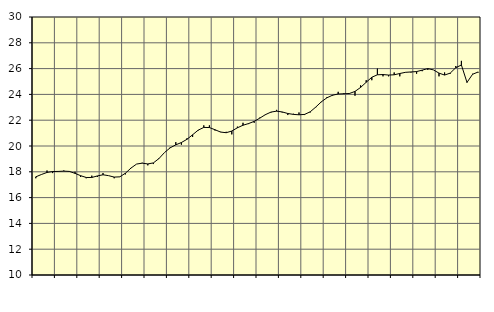
| Category | Piggar | Finansiell verksamhet, företagstjänster, SNI 64-82 |
|---|---|---|
| nan | 17.5 | 17.61 |
| 1.0 | 17.8 | 17.79 |
| 1.0 | 18.1 | 17.95 |
| 1.0 | 17.9 | 18.02 |
| nan | 18 | 18.03 |
| 2.0 | 18.1 | 18.05 |
| 2.0 | 18 | 18.03 |
| 2.0 | 18 | 17.88 |
| nan | 17.6 | 17.7 |
| 3.0 | 17.5 | 17.56 |
| 3.0 | 17.7 | 17.56 |
| 3.0 | 17.6 | 17.68 |
| nan | 17.9 | 17.77 |
| 4.0 | 17.7 | 17.7 |
| 4.0 | 17.5 | 17.59 |
| 4.0 | 17.6 | 17.61 |
| nan | 17.8 | 17.89 |
| 5.0 | 18.3 | 18.29 |
| 5.0 | 18.6 | 18.6 |
| 5.0 | 18.7 | 18.67 |
| nan | 18.5 | 18.61 |
| 6.0 | 18.6 | 18.69 |
| 6.0 | 19 | 19.03 |
| 6.0 | 19.5 | 19.5 |
| nan | 19.9 | 19.86 |
| 7.0 | 20.3 | 20.09 |
| 7.0 | 20.1 | 20.27 |
| 7.0 | 20.6 | 20.52 |
| nan | 20.7 | 20.87 |
| 8.0 | 21.2 | 21.23 |
| 8.0 | 21.6 | 21.44 |
| 8.0 | 21.6 | 21.43 |
| nan | 21.2 | 21.26 |
| 9.0 | 21.1 | 21.08 |
| 9.0 | 21.1 | 21.03 |
| 9.0 | 20.9 | 21.16 |
| nan | 21.5 | 21.41 |
| 10.0 | 21.8 | 21.61 |
| 10.0 | 21.7 | 21.74 |
| 10.0 | 21.8 | 21.91 |
| nan | 22.2 | 22.16 |
| 11.0 | 22.4 | 22.43 |
| 11.0 | 22.6 | 22.63 |
| 11.0 | 22.8 | 22.7 |
| nan | 22.6 | 22.64 |
| 12.0 | 22.4 | 22.52 |
| 12.0 | 22.5 | 22.45 |
| 12.0 | 22.6 | 22.42 |
| nan | 22.4 | 22.45 |
| 13.0 | 22.6 | 22.65 |
| 13.0 | 23 | 23.02 |
| 13.0 | 23.4 | 23.43 |
| nan | 23.8 | 23.74 |
| 14.0 | 23.9 | 23.94 |
| 14.0 | 24.2 | 24.03 |
| 14.0 | 24.1 | 24.05 |
| nan | 24.1 | 24.07 |
| 15.0 | 23.9 | 24.23 |
| 15.0 | 24.7 | 24.54 |
| 15.0 | 25.1 | 24.94 |
| nan | 25.1 | 25.33 |
| 16.0 | 26 | 25.52 |
| 16.0 | 25.4 | 25.54 |
| 16.0 | 25.4 | 25.5 |
| nan | 25.7 | 25.52 |
| 17.0 | 25.4 | 25.62 |
| 17.0 | 25.7 | 25.71 |
| 17.0 | 25.7 | 25.74 |
| nan | 25.6 | 25.77 |
| 18.0 | 25.8 | 25.88 |
| 18.0 | 25.9 | 26 |
| 18.0 | 25.9 | 25.9 |
| nan | 25.4 | 25.65 |
| 19.0 | 25.7 | 25.5 |
| 19.0 | 25.6 | 25.65 |
| 19.0 | 26.2 | 26.07 |
| nan | 26.6 | 26.28 |
| 20.0 | 24.9 | 24.93 |
| 20.0 | 25.6 | 25.56 |
| 20.0 | 25.7 | 25.74 |